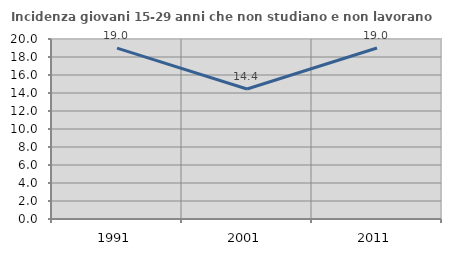
| Category | Incidenza giovani 15-29 anni che non studiano e non lavorano  |
|---|---|
| 1991.0 | 18.987 |
| 2001.0 | 14.448 |
| 2011.0 | 18.997 |